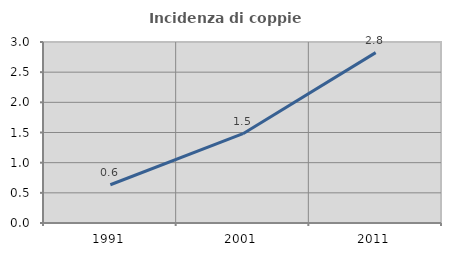
| Category | Incidenza di coppie miste |
|---|---|
| 1991.0 | 0.634 |
| 2001.0 | 1.48 |
| 2011.0 | 2.824 |